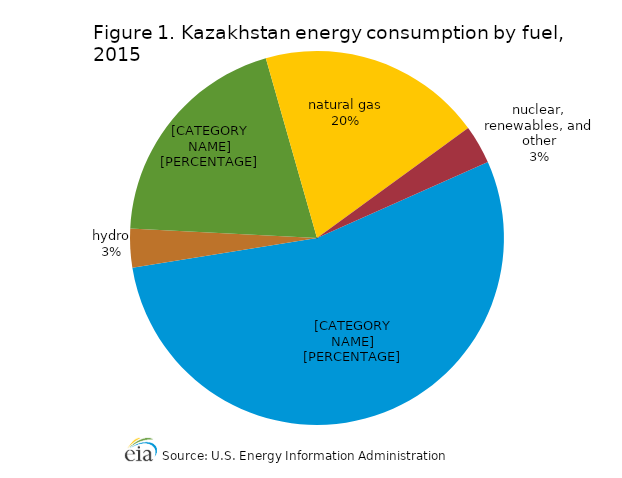
| Category | Series 0 |
|---|---|
| coal | 1.404 |
| hydro | 0.087 |
| petroleum | 0.513 |
| natural gas | 0.503 |
| nuclear, renewables, and other | 0.087 |